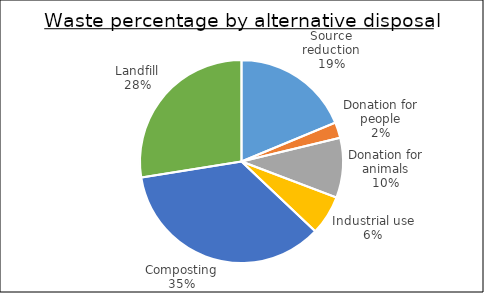
| Category | Series 0 |
|---|---|
| Source reduction | 1.73 |
| Donation for people | 0.23 |
| Donation for animals | 0.88 |
| Industrial use | 0.58 |
| Composting | 3.27 |
| Landfill | 2.54 |